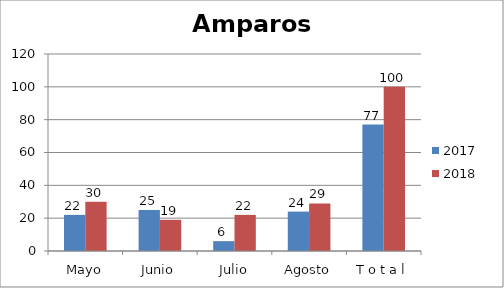
| Category | 2017 | 2018 |
|---|---|---|
| Mayo | 22 | 30 |
| Junio | 25 | 19 |
| Julio | 6 | 22 |
| Agosto | 24 | 29 |
| T o t a l | 77 | 100 |